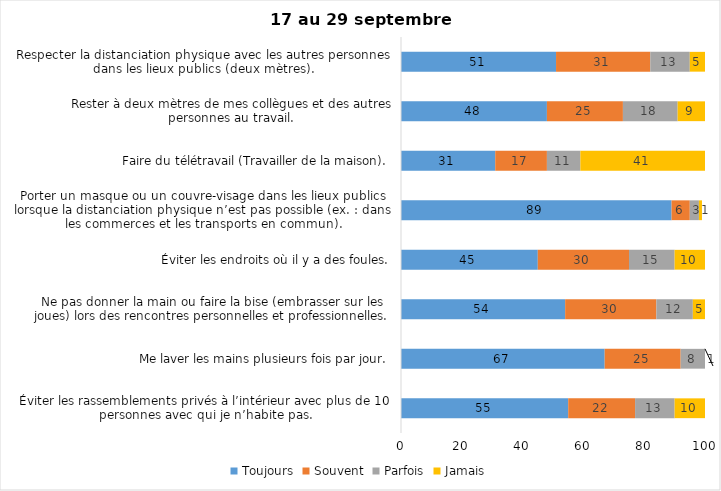
| Category | Toujours | Souvent | Parfois | Jamais |
|---|---|---|---|---|
| Éviter les rassemblements privés à l’intérieur avec plus de 10 personnes avec qui je n’habite pas. | 55 | 22 | 13 | 10 |
| Me laver les mains plusieurs fois par jour. | 67 | 25 | 8 | 1 |
| Ne pas donner la main ou faire la bise (embrasser sur les joues) lors des rencontres personnelles et professionnelles. | 54 | 30 | 12 | 5 |
| Éviter les endroits où il y a des foules. | 45 | 30 | 15 | 10 |
| Porter un masque ou un couvre-visage dans les lieux publics lorsque la distanciation physique n’est pas possible (ex. : dans les commerces et les transports en commun). | 89 | 6 | 3 | 1 |
| Faire du télétravail (Travailler de la maison). | 31 | 17 | 11 | 41 |
| Rester à deux mètres de mes collègues et des autres personnes au travail. | 48 | 25 | 18 | 9 |
| Respecter la distanciation physique avec les autres personnes dans les lieux publics (deux mètres). | 51 | 31 | 13 | 5 |